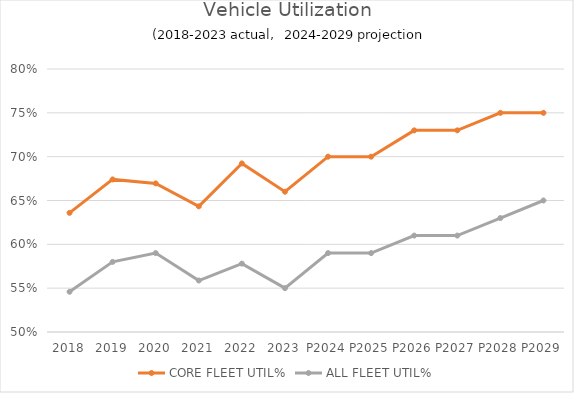
| Category | CORE FLEET UTIL% | ALL FLEET UTIL% |
|---|---|---|
| 2018 | 0.636 | 0.546 |
| 2019 | 0.674 | 0.58 |
| 2020 | 0.669 | 0.59 |
| 2021 | 0.643 | 0.559 |
| 2022 | 0.692 | 0.578 |
| 2023 | 0.66 | 0.55 |
| P2024 | 0.7 | 0.59 |
| P2025 | 0.7 | 0.59 |
| P2026 | 0.73 | 0.61 |
| P2027 | 0.73 | 0.61 |
| P2028 | 0.75 | 0.63 |
| P2029 | 0.75 | 0.65 |